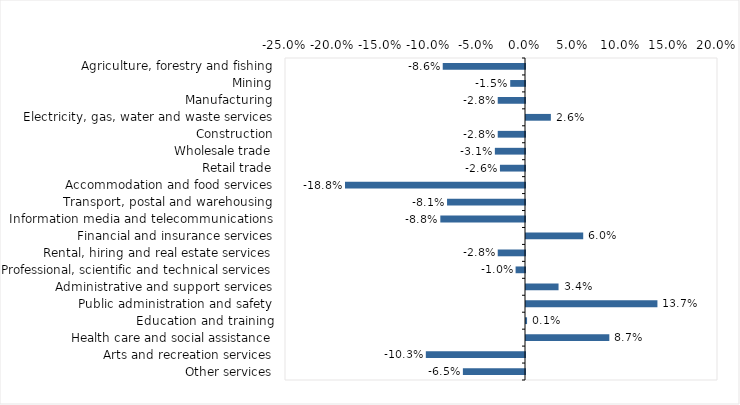
| Category | This week |
|---|---|
| Agriculture, forestry and fishing | -0.086 |
| Mining | -0.015 |
| Manufacturing | -0.028 |
| Electricity, gas, water and waste services | 0.026 |
| Construction | -0.028 |
| Wholesale trade | -0.031 |
| Retail trade | -0.026 |
| Accommodation and food services | -0.188 |
| Transport, postal and warehousing | -0.081 |
| Information media and telecommunications | -0.088 |
| Financial and insurance services | 0.06 |
| Rental, hiring and real estate services | -0.028 |
| Professional, scientific and technical services | -0.01 |
| Administrative and support services | 0.034 |
| Public administration and safety | 0.137 |
| Education and training | 0.001 |
| Health care and social assistance | 0.087 |
| Arts and recreation services | -0.103 |
| Other services | -0.065 |